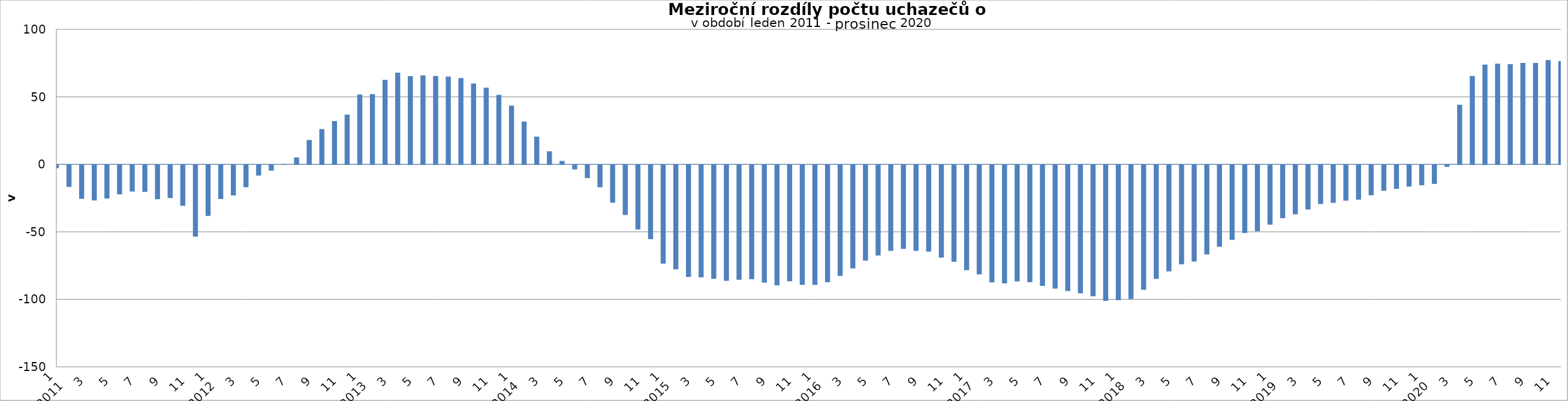
| Category | Series 1 |
|---|---|
| 0 | -2363 |
| 1 | -16239 |
| 2 | -25062 |
| 3 | -26286 |
| 4 | -24823 |
| 5 | -21725 |
| 6 | -19700 |
| 7 | -19959 |
| 8 | -25366 |
| 9 | -24543 |
| 10 | -30236 |
| 11 | -53100 |
| 12 | -37774 |
| 13 | -25211 |
| 14 | -22582 |
| 15 | -16520 |
| 16 | -7857 |
| 17 | -4189 |
| 18 | 13 |
| 19 | 5158 |
| 20 | 18070 |
| 21 | 26144 |
| 22 | 32094 |
| 23 | 36860 |
| 24 | 51720 |
| 25 | 51998 |
| 26 | 62588 |
| 27 | 67906 |
| 28 | 65364 |
| 29 | 65887 |
| 30 | 65499 |
| 31 | 65038 |
| 32 | 63873 |
| 33 | 59919 |
| 34 | 56815 |
| 35 | 51522 |
| 36 | 43465 |
| 37 | 31707 |
| 38 | 20547 |
| 39 | 9680 |
| 40 | 2510 |
| 41 | -3294 |
| 42 | -9732 |
| 43 | -16506 |
| 44 | -27960 |
| 45 | -37043 |
| 46 | -47805 |
| 47 | -54919 |
| 48 | -73083 |
| 49 | -77273 |
| 50 | -83000 |
| 51 | -83323 |
| 52 | -84284 |
| 53 | -85784 |
| 54 | -85023 |
| 55 | -84559 |
| 56 | -87206 |
| 57 | -89206 |
| 58 | -86144 |
| 59 | -88796 |
| 60 | -88788 |
| 61 | -86863 |
| 62 | -82206 |
| 63 | -76625 |
| 64 | -70900 |
| 65 | -67067 |
| 66 | -63674 |
| 67 | -62192 |
| 68 | -63634 |
| 69 | -64188 |
| 70 | -68609 |
| 71 | -71745 |
| 72 | -77987 |
| 73 | -81046 |
| 74 | -86997 |
| 75 | -87761 |
| 76 | -86268 |
| 77 | -86889 |
| 78 | -89593 |
| 79 | -91648 |
| 80 | -93343 |
| 81 | -95071 |
| 82 | -97286 |
| 83 | -100753 |
| 84 | -100188 |
| 85 | -99309 |
| 86 | -92504 |
| 87 | -84401 |
| 88 | -78889 |
| 89 | -73653 |
| 90 | -71509 |
| 91 | -66327 |
| 92 | -60584 |
| 93 | -55551 |
| 94 | -50459 |
| 95 | -49086 |
| 96 | -44171 |
| 97 | -39482 |
| 98 | -36555 |
| 99 | -32970 |
| 100 | -28957 |
| 101 | -28063 |
| 102 | -26445 |
| 103 | -25710 |
| 104 | -22424 |
| 105 | -19104 |
| 106 | -17721 |
| 107 | -16002 |
| 108 | -15035 |
| 109 | -14048 |
| 110 | -1375 |
| 111 | 44212 |
| 112 | 65469 |
| 113 | 73914 |
| 114 | 74553 |
| 115 | 74289 |
| 116 | 75108 |
| 117 | 75167 |
| 118 | 77237 |
| 119 | 76445 |